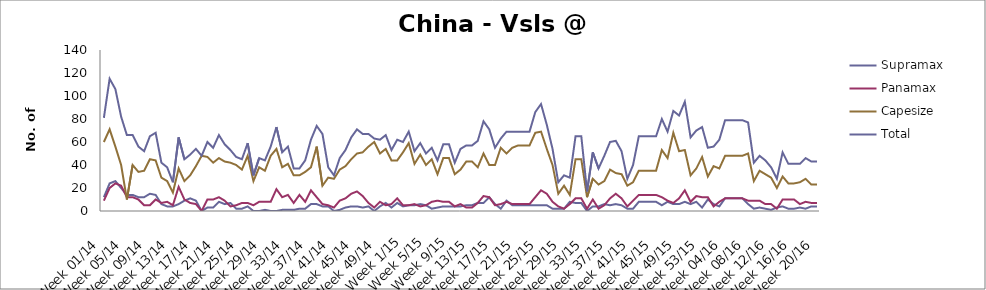
| Category | Supramax | Panamax | Capesize | Total |
|---|---|---|---|---|
| Week 01/14 | 12 | 9 | 60 | 81 |
| Week 02/14 | 24 | 20 | 71 | 115 |
| Week 03/14 | 26 | 24 | 56 | 106 |
| Week 04/14 | 20 | 22 | 40 | 82 |
| Week 05/14 | 14 | 12 | 10 | 66 |
| Week 06/14 | 14 | 12 | 40 | 66 |
| Week 07/14 | 12 | 10 | 34 | 56 |
| Week 08/14 | 12 | 5 | 35 | 52 |
| Week 09/14 | 15 | 5 | 45 | 65 |
| Week 10/14 | 14 | 10 | 44 | 68 |
| Week 11/14 | 6 | 7 | 29 | 42 |
| Week 12/14 | 4 | 8 | 26 | 38 |
| Week 13/14 | 4 | 5 | 16 | 25 |
| Week 14/14 | 6 | 21 | 37 | 64 |
| Week 15/14 | 9 | 10 | 26 | 45 |
| Week 16/14 | 11 | 7 | 31 | 49 |
| Week 17/14 | 9 | 6 | 39 | 54 |
| Week 18/14 | 0 | 0 | 48 | 48 |
| Week 19/14 | 3 | 10 | 47 | 60 |
| Week 20/14 | 3 | 10 | 42 | 55 |
| Week 21/14 | 8 | 12 | 46 | 66 |
| Week 22/14 | 6 | 9 | 43 | 58 |
| Week 23/14 | 7 | 4 | 42 | 53 |
| Week 24/14 | 2 | 5 | 40 | 47 |
| Week 25/14 | 2 | 7 | 36 | 45 |
| Week 26/14 | 4 | 7 | 48 | 59 |
| Week 27/14 | 0 | 5 | 26 | 31 |
| Week 28/14 | 0 | 8 | 38 | 46 |
| Week 29/14 | 1 | 8 | 35 | 44 |
| Week 30/14 | 0 | 8 | 48 | 56 |
| Week 31/14 | 0 | 19 | 54 | 73 |
| Week 32/14 | 1 | 12 | 38 | 51 |
| Week 33/14 | 1 | 14 | 41 | 56 |
| Week 34/14 | 1 | 7 | 31 | 37 |
| Week 35/14 | 2 | 14 | 31 | 37 |
| Week 36/14 | 2 | 8 | 34 | 44 |
| Week 37/14 | 6 | 18 | 38 | 62 |
| Week 38/14 | 6 | 12 | 56 | 74 |
| Week 39/14 | 4 | 6 | 22 | 67 |
| Week 40/14 | 4 | 5 | 29 | 38 |
| Week 41/14 | 0 | 3 | 28 | 31 |
| Week 42/14 | 1 | 9 | 36 | 46 |
| Week 43/14 | 3 | 11 | 39 | 53 |
| Week 44/14 | 4 | 15 | 45 | 64 |
| Week 45/14 | 4 | 17 | 50 | 71 |
| Week 46/14 | 3 | 13 | 51 | 67 |
| Week 47/14 | 4 | 7 | 56 | 67 |
| Week 48/14 | 0 | 3 | 60 | 63 |
| Week 49/14 | 4 | 8 | 50 | 62 |
| Week 50/14 | 7 | 5 | 54 | 66 |
| Week 51/14 | 3 | 6 | 44 | 53 |
| Week 52/14 | 7 | 11 | 44 | 62 |
| Week 1/15 | 4 | 5 | 51 | 60 |
| Week 2/15 | 5 | 5 | 59 | 69 |
| Week 3/15 | 5 | 6 | 41 | 52 |
| Week 4/15 | 6 | 4 | 49 | 59 |
| Week 5/15 | 5 | 5 | 40 | 50 |
| Week 6/15 | 2 | 8 | 45 | 55 |
| Week 7/15 | 3 | 9 | 32 | 44 |
| Week 8/15 | 4 | 8 | 46 | 58 |
| Week 9/15 | 4 | 8 | 46 | 58 |
| Week 10/15 | 4 | 4 | 32 | 42 |
| Week 11/15 | 4 | 6 | 36 | 54 |
| Week 12/15 | 5 | 3 | 43 | 57 |
| Week 13/15 | 5 | 3 | 43 | 57 |
| Week 14/15 | 7 | 7 | 38 | 61 |
| Week 15/15 | 7 | 13 | 50 | 78 |
| Week 16/15 | 12 | 12 | 40 | 71 |
| Week 17/15 | 6 | 5 | 40 | 55 |
| Week 18/15 | 2 | 6 | 55 | 63 |
| Week 19/15 | 9 | 8 | 50 | 69 |
| Week 20/15 | 5 | 6 | 55 | 69 |
| Week 21/15 | 5 | 6 | 57 | 69 |
| Week 22/15 | 5 | 6 | 57 | 69 |
| Week 23/15 | 5 | 6 | 57 | 69 |
| Week 24/15 | 5 | 12 | 68 | 86 |
| Week 25/15 | 5 | 18 | 69 | 93 |
| Week 26/15 | 5 | 15 | 54 | 75 |
| Week 27/15 | 2 | 8 | 40 | 54 |
| Week 28/15 | 2 | 4 | 15 | 25 |
| Week 29/15 | 2 | 2 | 22 | 31 |
| Week 30/15 | 8 | 6 | 14 | 29 |
| Week 31/15 | 7 | 11 | 45 | 65 |
| Week 32/15 | 7 | 11 | 45 | 65 |
| Week 33/15 | 0 | 2 | 12 | 17 |
| Week 34/15 | 4 | 10 | 28 | 51 |
| Week 35/15 | 4 | 2 | 23 | 37 |
| Week 36/15 | 6 | 5 | 26 | 48 |
| Week 37/15 | 5 | 11 | 36 | 60 |
| Week 38/15 | 6 | 15 | 33 | 61 |
| Week 39/15 | 5 | 11 | 32 | 52 |
| Week 40/15 | 2 | 4 | 22 | 28 |
| Week 41/15 | 2 | 9 | 25 | 40 |
| Week 42/15 | 8 | 14 | 35 | 65 |
| Week 43/15 | 8 | 14 | 35 | 65 |
| Week 44/15 | 8 | 14 | 35 | 65 |
| Week 45/15 | 8 | 14 | 35 | 65 |
| Week 46/15 | 5 | 12 | 53 | 80 |
| Week 47/15 | 8 | 9 | 46 | 69 |
| Week 48/15 | 6 | 7 | 68 | 87 |
| Week 49/15 | 6 | 11 | 52 | 83 |
| Week 50/15 | 8 | 18 | 53 | 95 |
| Week 51/15 | 6 | 8 | 31 | 64 |
| Week 52/15 | 8 | 13 | 37 | 70 |
| Week 53/15 | 3 | 12 | 47 | 73 |
| Week 01/16 | 10 | 12 | 30 | 55 |
| Week 02/16 | 6 | 4 | 39 | 56 |
| Week 03/16 | 4 | 8 | 37 | 62 |
| Week 04/16 | 11 | 11 | 48 | 79 |
| Week 05/16 | 11 | 11 | 48 | 79 |
| Week 06/16 | 11 | 11 | 48 | 79 |
| Week 07/16 | 11 | 11 | 48 | 79 |
| Week 08/16 | 6 | 9 | 50 | 77 |
| Week 09/16 | 2 | 9 | 26 | 42 |
| Week 10/16 | 3 | 9 | 35 | 48 |
| Week 11/16 | 2 | 6 | 32 | 44 |
| Week 12/16 | 1 | 6 | 29 | 38 |
| Week 13/16 | 3 | 2 | 20 | 28 |
| Week 14/16 | 4 | 10 | 30 | 51 |
| Week 15/16 | 2 | 10 | 24 | 41 |
| Week 16/16 | 2 | 10 | 24 | 41 |
| Week 17/16 | 3 | 6 | 25 | 41 |
| Week 18/16 | 2 | 8 | 28 | 46 |
| Week 19/16 | 4 | 7 | 23 | 43 |
| Week 20/16 | 4 | 7 | 23 | 43 |